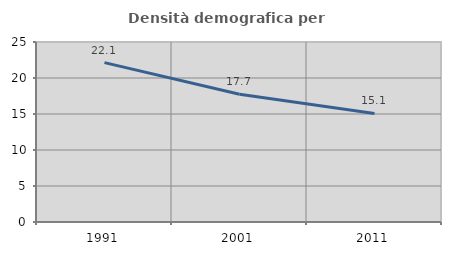
| Category | Densità demografica |
|---|---|
| 1991.0 | 22.134 |
| 2001.0 | 17.74 |
| 2011.0 | 15.081 |